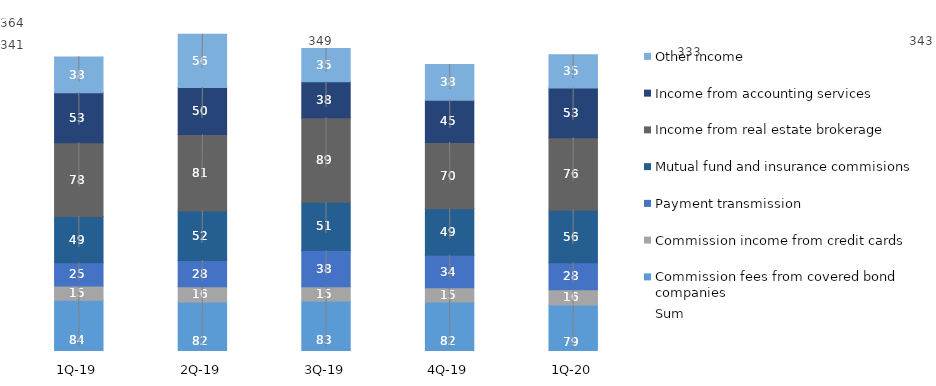
| Category | Commission fees from covered bond companies | Commission income from credit cards | Payment transmission | Mutual fund and insurance commisions | Income from real estate brokerage | Income from accounting services | Other income |
|---|---|---|---|---|---|---|---|
| 1Q-20 | 78.983 | 16.14 | 28.326 | 55.562 | 76.287 | 52.513 | 34.973 |
| 4Q-19 | 82.3 | 14.8 | 34.4 | 49.1 | 69.7 | 44.5 | 37.8 |
| 3Q-19 | 83.345 | 15 | 38 | 51 | 89 | 38 | 35 |
| 2Q-19 | 82.097 | 16.08 | 27.71 | 52.19 | 80.63 | 49.6 | 56.1 |
| 1Q-19 | 84.154 | 14.808 | 24.665 | 48.809 | 77.601 | 52.707 | 37.808 |